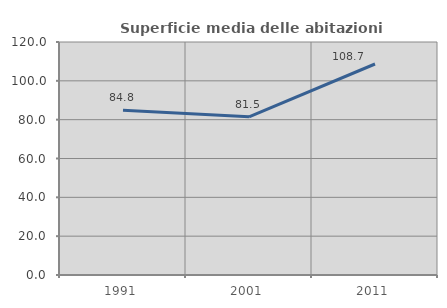
| Category | Superficie media delle abitazioni occupate |
|---|---|
| 1991.0 | 84.786 |
| 2001.0 | 81.496 |
| 2011.0 | 108.667 |